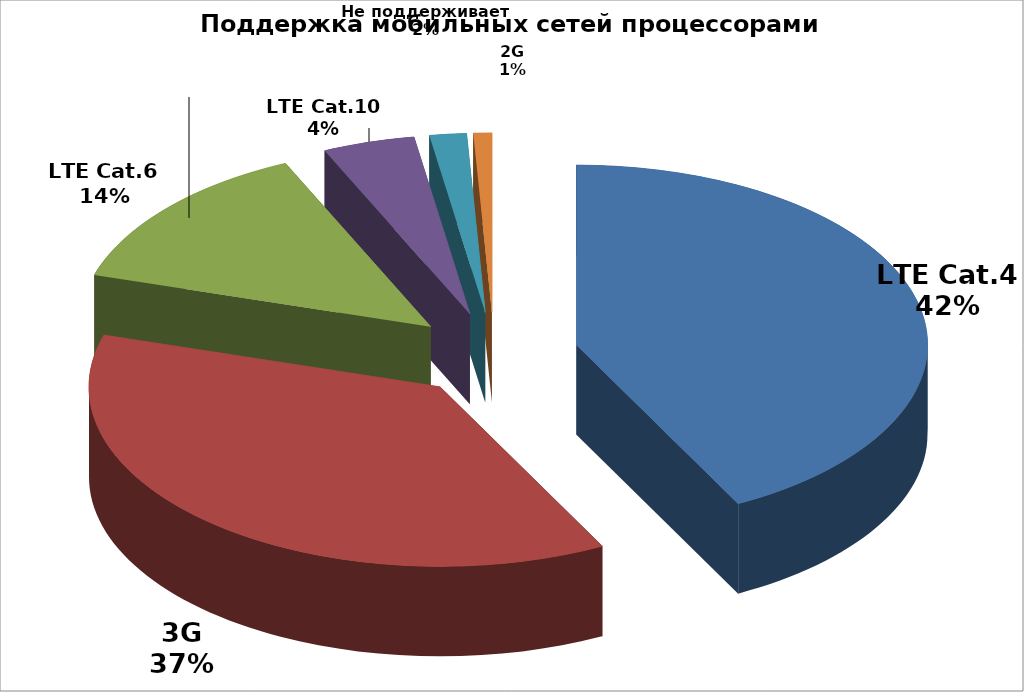
| Category | Series 0 |
|---|---|
| LTE Cat.4 | 50 |
| 3G | 44 |
| LTE Cat.6 | 16 |
| LTE Cat.10 | 5 |
| Не поддерживает | 2 |
| 2G | 1 |